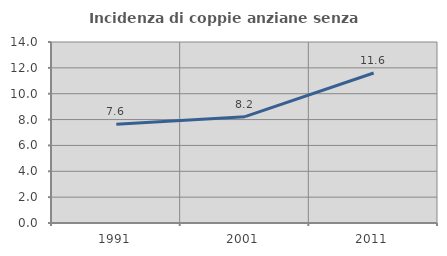
| Category | Incidenza di coppie anziane senza figli  |
|---|---|
| 1991.0 | 7.642 |
| 2001.0 | 8.224 |
| 2011.0 | 11.603 |